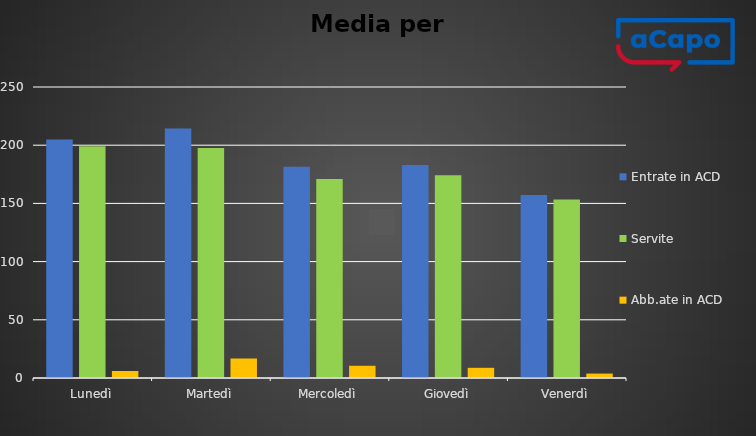
| Category | Entrate in ACD | Servite | Abb.ate in ACD |
|---|---|---|---|
| Lunedì | 205 | 199 | 6 |
| Martedì | 214.25 | 197.5 | 16.75 |
| Mercoledì | 181.5 | 171 | 10.5 |
| Giovedì | 183 | 174.25 | 8.75 |
| Venerdì | 157.2 | 153.4 | 3.8 |